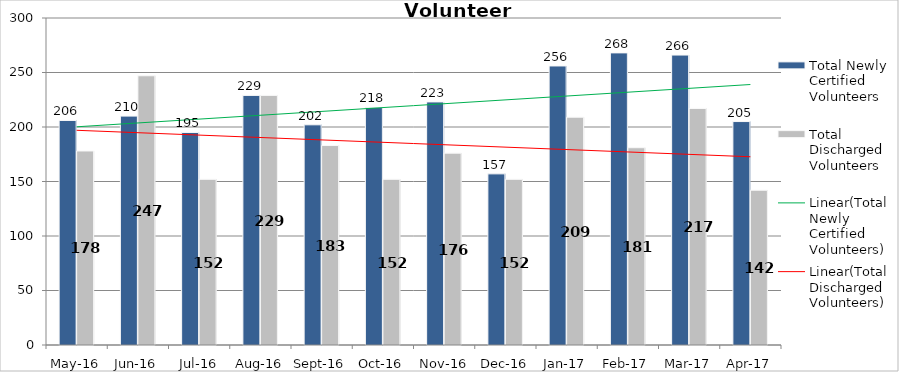
| Category | Total Newly Certified Volunteers | Total Discharged Volunteers |
|---|---|---|
| May-16 | 206 | 178 |
| Jun-16 | 210 | 247 |
| Jul-16 | 195 | 152 |
| Aug-16 | 229 | 229 |
| Sep-16 | 202 | 183 |
| Oct-16 | 218 | 152 |
| Nov-16 | 223 | 176 |
| Dec-16 | 157 | 152 |
| Jan-17 | 256 | 209 |
| Feb-17 | 268 | 181 |
| Mar-17 | 266 | 217 |
| Apr-17 | 205 | 142 |